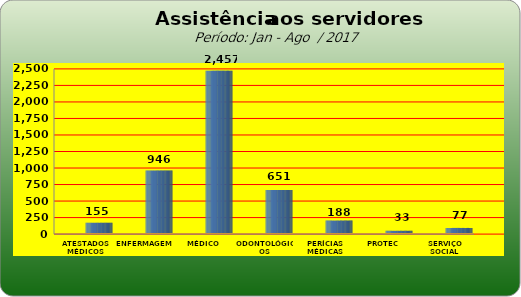
| Category | Series 0 |
|---|---|
| ATESTADOS MÉDICOS | 155 |
| ENFERMAGEM | 946 |
| MÉDICO | 2457 |
| ODONTOLÓGICOS | 651 |
| PERÍCIAS MÉDICAS | 188 |
| PROTEC | 33 |
| SERVIÇO SOCIAL | 77 |